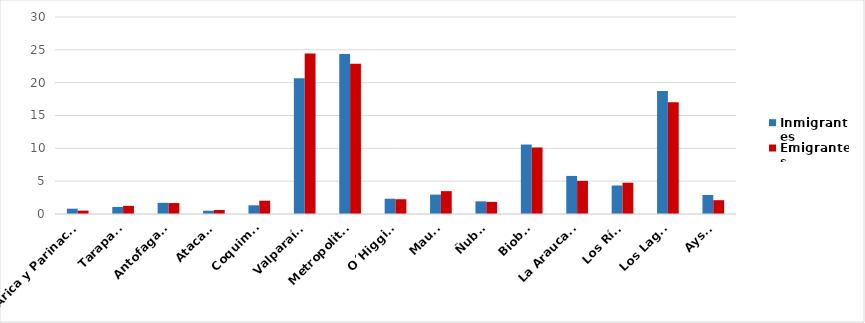
| Category | Inmigrantes | Emigrantes |
|---|---|---|
| Arica y Parinacota | 0.812 | 0.516 |
| Tarapacá | 1.077 | 1.243 |
| Antofagasta | 1.706 | 1.667 |
| Atacama | 0.497 | 0.608 |
| Coquimbo | 1.325 | 2.02 |
| Valparaíso | 20.659 | 24.438 |
| Metropolitana | 24.375 | 22.885 |
| O´Higgins | 2.33 | 2.248 |
| Maule | 2.954 | 3.48 |
| Ñuble | 1.927 | 1.846 |
| Biobío | 10.578 | 10.131 |
| La Araucanía | 5.797 | 5.049 |
| Los Ríos | 4.339 | 4.762 |
| Los Lagos | 18.727 | 17.005 |
| Aysén | 2.898 | 2.101 |